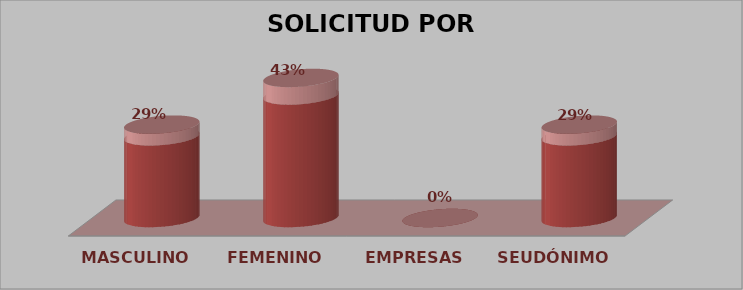
| Category | SOLICITUD POR GÉNERO | Series 1 |
|---|---|---|
| MASCULINO | 2 | 0.286 |
| FEMENINO | 3 | 0.429 |
| EMPRESAS | 0 | 0 |
| SEUDÓNIMO | 2 | 0.286 |